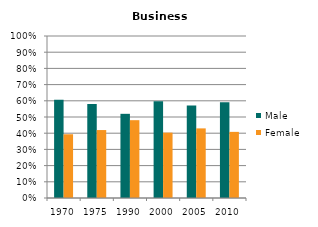
| Category | Male | Female |
|---|---|---|
| 1970.0 | 0.607 | 0.393 |
| 1975.0 | 0.581 | 0.419 |
| 1990.0 | 0.52 | 0.48 |
| 2000.0 | 0.596 | 0.404 |
| 2005.0 | 0.57 | 0.43 |
| 2010.0 | 0.592 | 0.408 |